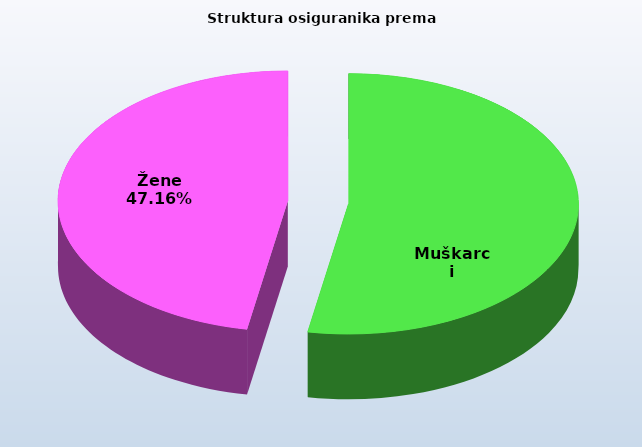
| Category | Series 0 |
|---|---|
| Muškarci | 837922 |
| Žene | 747907 |